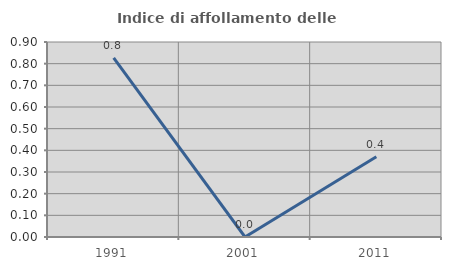
| Category | Indice di affollamento delle abitazioni  |
|---|---|
| 1991.0 | 0.826 |
| 2001.0 | 0 |
| 2011.0 | 0.37 |